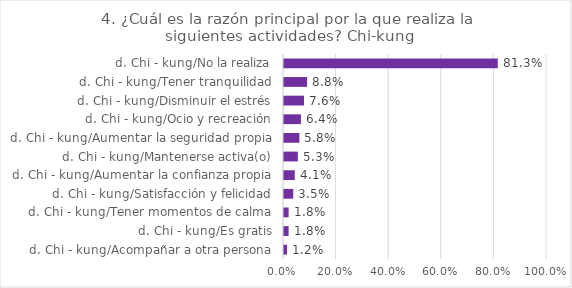
| Category | Series 0 |
|---|---|
| d. Chi - kung/Acompañar a otra persona | 0.012 |
| d. Chi - kung/Es gratis | 0.018 |
| d. Chi - kung/Tener momentos de calma | 0.018 |
| d. Chi - kung/Satisfacción y felicidad | 0.035 |
| d. Chi - kung/Aumentar la confianza propia | 0.041 |
| d. Chi - kung/Mantenerse activa(o) | 0.053 |
| d. Chi - kung/Aumentar la seguridad propia | 0.058 |
| d. Chi - kung/Ocio y recreación | 0.064 |
| d. Chi - kung/Disminuir el estrés | 0.076 |
| d. Chi - kung/Tener tranquilidad | 0.088 |
| d. Chi - kung/No la realiza | 0.813 |